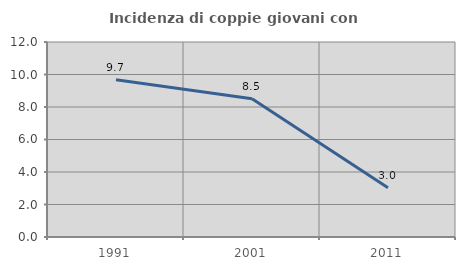
| Category | Incidenza di coppie giovani con figli |
|---|---|
| 1991.0 | 9.677 |
| 2001.0 | 8.511 |
| 2011.0 | 3.03 |